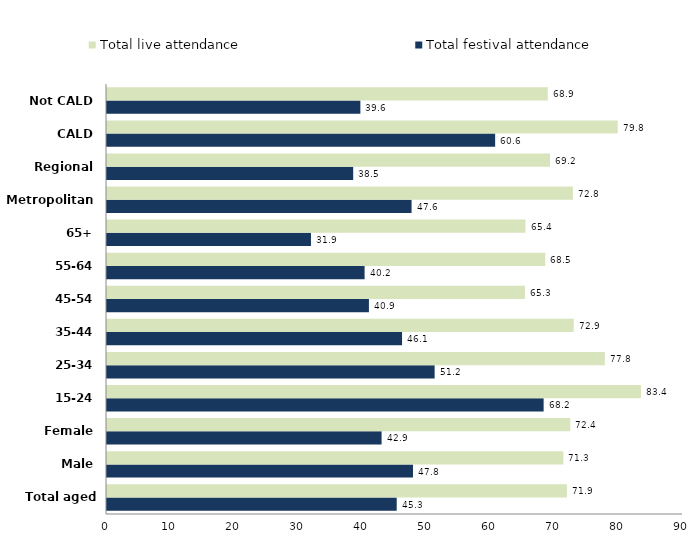
| Category | Total festival attendance | Total live attendance |
|---|---|---|
| Total aged 15+ | 45.268 | 71.865 |
| Male | 47.81 | 71.309 |
| Female | 42.903 | 72.385 |
| 15-24 | 68.224 | 83.427 |
| 25-34 | 51.192 | 77.781 |
| 35-44 | 46.103 | 72.928 |
| 45-54 | 40.925 | 65.305 |
| 55-64 | 40.248 | 68.476 |
| 65+ | 31.87 | 65.394 |
| Metropolitan | 47.59 | 72.796 |
| Regional | 38.467 | 69.229 |
| CALD | 60.648 | 79.799 |
| Not CALD | 39.59 | 68.869 |